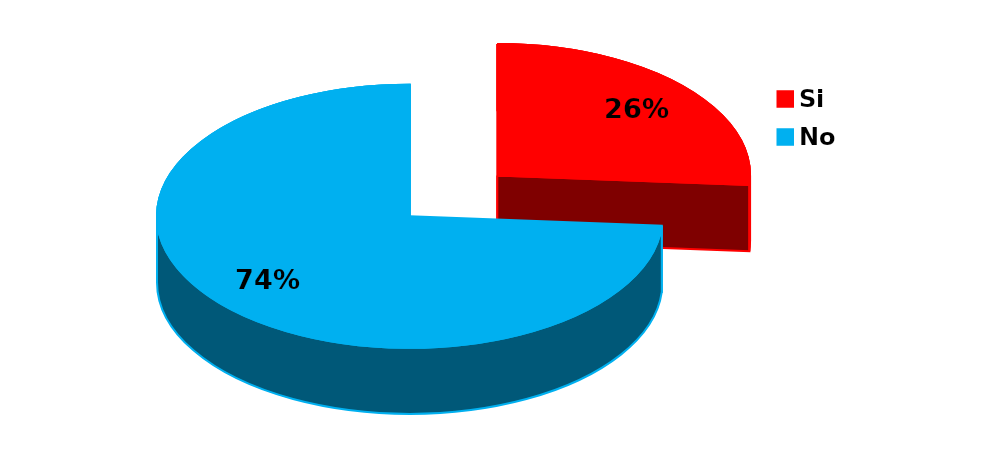
| Category | Series 0 |
|---|---|
| Si | 17 |
| No | 48 |